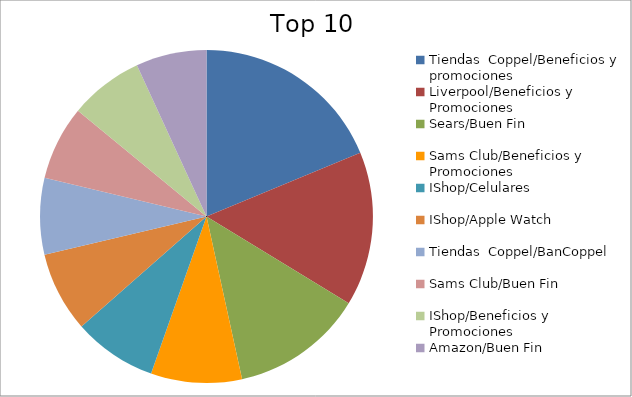
| Category | Series 0 |
|---|---|
| Tiendas  Coppel/Beneficios y promociones | 11.31 |
| Liverpool/Beneficios y Promociones | 9.03 |
| Sears/Buen Fin | 7.76 |
| Sams Club/Beneficios y Promociones | 5.33 |
| IShop/Celulares | 4.9 |
| IShop/Apple Watch | 4.7 |
| Tiendas  Coppel/BanCoppel | 4.48 |
| Sams Club/Buen Fin | 4.36 |
| IShop/Beneficios y Promociones | 4.33 |
| Amazon/Buen Fin | 4.14 |